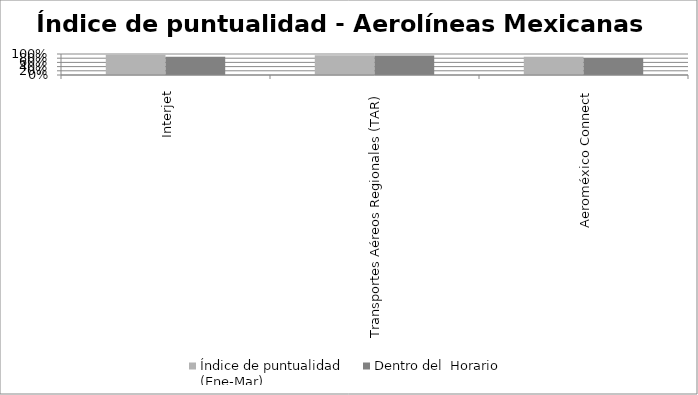
| Category | Índice de puntualidad
(Ene-Mar) | Dentro del  Horario |
|---|---|---|
| Interjet | 0.96 | 0.864 |
| Transportes Aéreos Regionales (TAR) | 0.937 | 0.933 |
| Aeroméxico Connect | 0.872 | 0.811 |